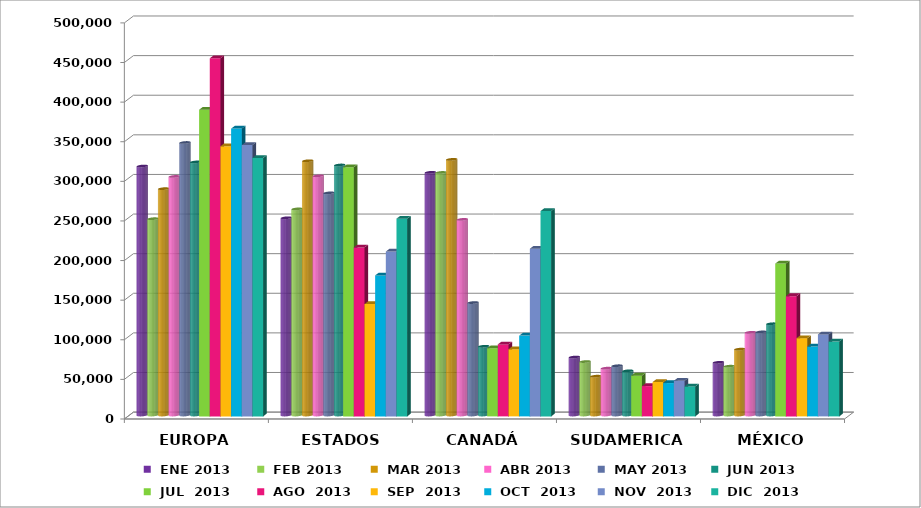
| Category |  ENE 2013 |  FEB 2013 |  MAR 2013 |  ABR 2013 |  MAY 2013 |  JUN 2013 |  JUL  2013 |  AGO  2013 |  SEP  2013 |  OCT  2013 |  NOV  2013 |  DIC  2013 |
|---|---|---|---|---|---|---|---|---|---|---|---|---|
| EUROPA | 314281 | 247793 | 285718 | 301140 | 343989 | 319469 | 387069 | 452007 | 341023 | 363260 | 342460 | 326269 |
| ESTADOS UNIDOS | 248959.375 | 260162 | 320931 | 301926 | 280417 | 315590 | 314602 | 213310 | 141712 | 177960 | 208068 | 249574 |
| CANADÁ | 306323 | 306164 | 322699 | 246923 | 141928 | 86756 | 86049 | 90876 | 84773 | 101953 | 211700 | 259148 |
| SUDAMERICA | 73174 | 67472 | 48998 | 59137 | 62183 | 55780 | 51439 | 38231 | 43365 | 42044 | 45015 | 37812 |
| MÉXICO | 66523.975 | 61603 | 83127 | 104358 | 104900 | 115192 | 192882 | 151794 | 98749 | 88147 | 103460 | 94460 |